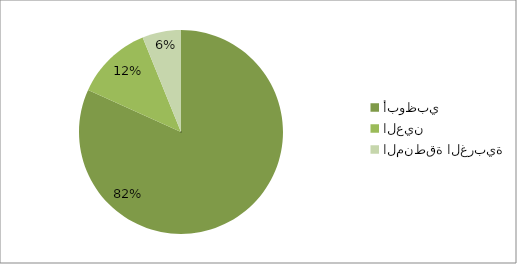
| Category | Series 0 |
|---|---|
| أبوظبي | 27186.5 |
| العين | 4022.6 |
| المنطقة الغربية | 2038.2 |